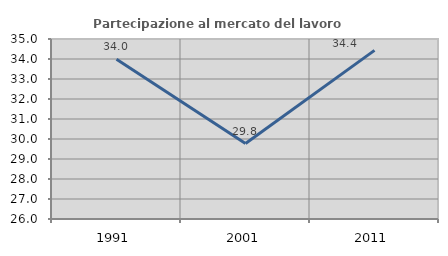
| Category | Partecipazione al mercato del lavoro  femminile |
|---|---|
| 1991.0 | 33.99 |
| 2001.0 | 29.775 |
| 2011.0 | 34.433 |